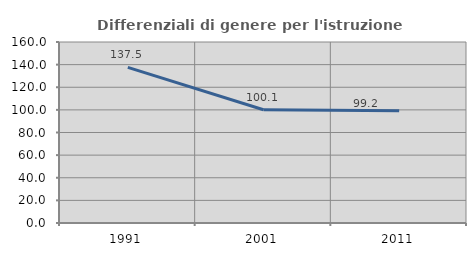
| Category | Differenziali di genere per l'istruzione superiore |
|---|---|
| 1991.0 | 137.51 |
| 2001.0 | 100.102 |
| 2011.0 | 99.211 |